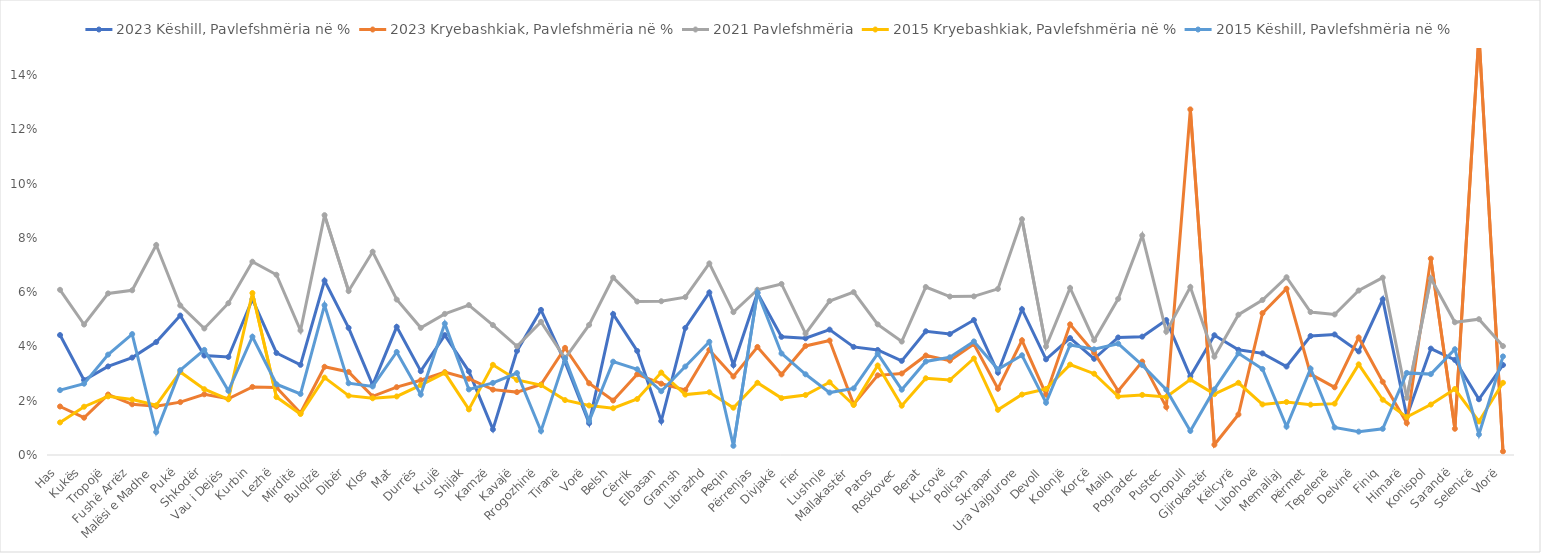
| Category | 2023 Këshill, Pavlefshmëria në % | 2023 Kryebashkiak, Pavlefshmëria në % | 2021 Pavlefshmëria | 2015 Kryebashkiak, Pavlefshmëria në % | 2015 Këshill, Pavlefshmëria në % |
|---|---|---|---|---|---|
| Has | 0.044 | 0.018 | 0.061 | 0.012 | 0.024 |
| Kukës | 0.028 | 0.014 | 0.048 | 0.018 | 0.026 |
| Tropojë | 0.033 | 0.022 | 0.06 | 0.022 | 0.037 |
| Fushë Arrëz | 0.036 | 0.019 | 0.061 | 0.02 | 0.045 |
| Malësi e Madhe | 0.042 | 0.018 | 0.077 | 0.018 | 0.008 |
| Pukë | 0.051 | 0.019 | 0.055 | 0.031 | 0.031 |
| Shkodër | 0.037 | 0.022 | 0.047 | 0.024 | 0.039 |
| Vau i Dejës | 0.036 | 0.021 | 0.056 | 0.021 | 0.024 |
| Kurbin | 0.057 | 0.025 | 0.071 | 0.06 | 0.044 |
| Lezhë | 0.038 | 0.025 | 0.066 | 0.021 | 0.026 |
| Mirditë | 0.033 | 0.015 | 0.046 | 0.015 | 0.023 |
| Bulqizë | 0.064 | 0.033 | 0.088 | 0.029 | 0.055 |
| Dibër | 0.047 | 0.031 | 0.06 | 0.022 | 0.026 |
| Klos | 0.026 | 0.022 | 0.075 | 0.021 | 0.025 |
| Mat | 0.047 | 0.025 | 0.057 | 0.022 | 0.038 |
| Durrës | 0.031 | 0.028 | 0.047 | 0.026 | 0.022 |
| Krujë | 0.044 | 0.031 | 0.052 | 0.03 | 0.048 |
| Shijak | 0.031 | 0.028 | 0.055 | 0.017 | 0.024 |
| Kamzë | 0.009 | 0.024 | 0.048 | 0.033 | 0.027 |
| Kavajë | 0.038 | 0.023 | 0.04 | 0.028 | 0.03 |
| Rrogozhinë | 0.053 | 0.026 | 0.049 | 0.026 | 0.009 |
| Tiranë | 0.034 | 0.039 | 0.036 | 0.02 | 0.036 |
| Vorë | 0.012 | 0.026 | 0.048 | 0.018 | 0.013 |
| Belsh | 0.052 | 0.02 | 0.065 | 0.017 | 0.034 |
| Cërrik | 0.038 | 0.03 | 0.057 | 0.021 | 0.032 |
| Elbasan | 0.013 | 0.026 | 0.057 | 0.03 | 0.023 |
| Gramsh | 0.047 | 0.024 | 0.058 | 0.022 | 0.033 |
| Librazhd | 0.06 | 0.039 | 0.071 | 0.023 | 0.042 |
| Peqin | 0.033 | 0.029 | 0.053 | 0.017 | 0.003 |
| Përrenjas | 0.06 | 0.04 | 0.061 | 0.027 | 0.06 |
| Divjakë | 0.044 | 0.03 | 0.063 | 0.021 | 0.037 |
| Fier | 0.043 | 0.04 | 0.045 | 0.022 | 0.03 |
| Lushnje | 0.046 | 0.042 | 0.057 | 0.027 | 0.023 |
| Mallakastër | 0.04 | 0.019 | 0.06 | 0.018 | 0.025 |
| Patos | 0.039 | 0.029 | 0.048 | 0.033 | 0.037 |
| Roskovec | 0.035 | 0.03 | 0.042 | 0.018 | 0.024 |
| Berat | 0.046 | 0.037 | 0.062 | 0.028 | 0.034 |
| Kuçovë | 0.045 | 0.035 | 0.058 | 0.028 | 0.036 |
| Poliçan | 0.05 | 0.041 | 0.058 | 0.036 | 0.042 |
| Skrapar | 0.03 | 0.024 | 0.061 | 0.017 | 0.032 |
| Ura Vajgurore | 0.054 | 0.042 | 0.087 | 0.022 | 0.037 |
| Devoll | 0.035 | 0.022 | 0.04 | 0.024 | 0.019 |
| Kolonjë | 0.043 | 0.048 | 0.062 | 0.033 | 0.041 |
| Korçë | 0.035 | 0.038 | 0.042 | 0.03 | 0.039 |
| Maliq | 0.043 | 0.024 | 0.058 | 0.022 | 0.041 |
| Pogradec | 0.044 | 0.034 | 0.081 | 0.022 | 0.033 |
| Pustec | 0.05 | 0.018 | 0.045 | 0.021 | 0.024 |
| Dropull | 0.029 | 0.127 | 0.062 | 0.028 | 0.009 |
| Gjirokastër | 0.044 | 0.004 | 0.036 | 0.022 | 0.024 |
| Këlcyrë | 0.039 | 0.015 | 0.052 | 0.027 | 0.037 |
| Libohovë | 0.037 | 0.052 | 0.057 | 0.019 | 0.032 |
| Memaliaj | 0.033 | 0.061 | 0.066 | 0.02 | 0.01 |
| Përmet | 0.044 | 0.03 | 0.053 | 0.019 | 0.032 |
| Tepelenë | 0.044 | 0.025 | 0.052 | 0.019 | 0.01 |
| Delvinë | 0.038 | 0.043 | 0.061 | 0.033 | 0.009 |
| Finiq | 0.057 | 0.027 | 0.065 | 0.02 | 0.01 |
| Himarë | 0.014 | 0.012 | 0.021 | 0.014 | 0.03 |
| Konispol | 0.039 | 0.072 | 0.065 | 0.019 | 0.03 |
| Sarandë | 0.035 | 0.01 | 0.049 | 0.024 | 0.039 |
| Selenicë | 0.021 | 0.155 | 0.05 | 0.012 | 0.008 |
| Vlorë | 0.033 | 0.001 | 0.04 | 0.027 | 0.036 |